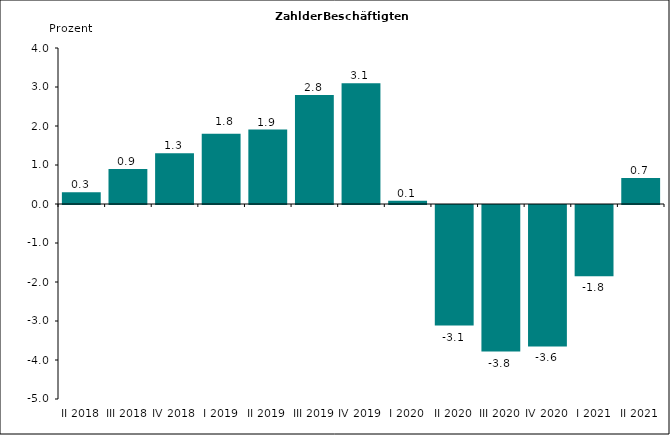
| Category | 0,3 |
|---|---|
| II 2018 | 0.3 |
| III 2018 | 0.9 |
| IV 2018 | 1.3 |
| I 2019 | 1.8 |
| II 2019 | 1.91 |
| III 2019 | 2.793 |
| IV 2019 | 3.093 |
| I 2020 | 0.085 |
| II 2020 | -3.091 |
| III 2020 | -3.759 |
| IV 2020 | -3.628 |
| I 2021 | -1.825 |
| II 2021 | 0.67 |